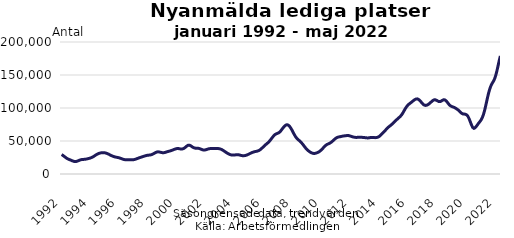
| Category | Series 0 |
|---|---|
| 1992.0 | 29480.354 |
| nan | 28295.696 |
| nan | 26913.85 |
| nan | 25477.81 |
| nan | 24127.512 |
| nan | 23002.58 |
| nan | 22155.383 |
| nan | 21457.833 |
| nan | 20717.486 |
| nan | 19914.451 |
| nan | 19238.304 |
| nan | 18853.792 |
| nan | 18929.346 |
| nan | 19447.209 |
| nan | 20222.154 |
| nan | 21019.832 |
| nan | 21638.498 |
| nan | 21956.335 |
| nan | 22084.468 |
| nan | 22247.052 |
| nan | 22501.828 |
| nan | 22845.831 |
| nan | 23261.049 |
| nan | 23738.07 |
| 1994.0 | 24324.906 |
| nan | 25049.806 |
| nan | 25955.045 |
| nan | 27078.029 |
| nan | 28325.565 |
| nan | 29517.866 |
| nan | 30500.082 |
| nan | 31227.831 |
| nan | 31748.909 |
| nan | 32146.252 |
| nan | 32323.003 |
| nan | 32297.941 |
| nan | 32066.145 |
| nan | 31577.25 |
| nan | 30898.522 |
| nan | 30048.377 |
| nan | 29077.009 |
| nan | 28162.808 |
| nan | 27332.881 |
| nan | 26566.956 |
| nan | 25974.012 |
| nan | 25562.385 |
| nan | 25202.474 |
| nan | 24849.817 |
| 1996.0 | 24346.643 |
| nan | 23717.093 |
| nan | 23034.567 |
| nan | 22358.507 |
| nan | 21859.059 |
| nan | 21586.713 |
| nan | 21478.229 |
| nan | 21481.852 |
| nan | 21473.305 |
| nan | 21402.079 |
| nan | 21410.324 |
| nan | 21507.307 |
| nan | 21765.412 |
| nan | 22273.67 |
| nan | 22897.424 |
| nan | 23569.016 |
| nan | 24261.453 |
| nan | 24890.283 |
| nan | 25489.139 |
| nan | 26075.808 |
| nan | 26682.501 |
| nan | 27301.593 |
| nan | 27867.632 |
| nan | 28278.9 |
| 1998.0 | 28529.016 |
| nan | 28691.848 |
| nan | 28995.719 |
| nan | 29600.406 |
| nan | 30466.934 |
| nan | 31497.214 |
| nan | 32534.847 |
| nan | 33305.431 |
| nan | 33600.298 |
| nan | 33386.99 |
| nan | 32949.643 |
| nan | 32488.886 |
| nan | 32233.319 |
| nan | 32344.363 |
| nan | 32741.234 |
| nan | 33350.71 |
| nan | 33962.663 |
| nan | 34467.893 |
| nan | 34975.758 |
| nan | 35556.485 |
| nan | 36214.074 |
| nan | 36973.075 |
| nan | 37687.105 |
| nan | 38257.472 |
| 2000.0 | 38621.123 |
| nan | 38519.491 |
| nan | 38136.336 |
| nan | 37831.522 |
| nan | 37861.54 |
| nan | 38429.195 |
| nan | 39489.467 |
| nan | 40949.947 |
| nan | 42498.245 |
| nan | 43571.771 |
| nan | 43670.076 |
| nan | 42891.24 |
| nan | 41610.902 |
| nan | 40374.347 |
| nan | 39568.488 |
| nan | 39136.694 |
| nan | 39027.603 |
| nan | 39024.347 |
| nan | 38744.869 |
| nan | 38119.748 |
| nan | 37323.39 |
| nan | 36628.944 |
| nan | 36283.726 |
| nan | 36458.739 |
| 2002.0 | 36928.067 |
| nan | 37543.713 |
| nan | 38133.537 |
| nan | 38446.343 |
| nan | 38515.878 |
| nan | 38457.017 |
| nan | 38451.435 |
| nan | 38534.178 |
| nan | 38599.809 |
| nan | 38610.029 |
| nan | 38509.351 |
| nan | 38221.437 |
| nan | 37670.383 |
| nan | 36865.356 |
| nan | 35762.005 |
| nan | 34529.413 |
| nan | 33298.501 |
| nan | 32075.164 |
| nan | 30962.868 |
| nan | 30014.234 |
| nan | 29272.074 |
| nan | 28784.995 |
| nan | 28610.435 |
| nan | 28658.771 |
| 2004.0 | 28922.799 |
| nan | 29227.993 |
| nan | 29297.582 |
| nan | 29063.631 |
| nan | 28579.689 |
| nan | 28063.258 |
| nan | 27756.917 |
| nan | 27684.535 |
| nan | 27892.932 |
| nan | 28340.013 |
| nan | 29012.874 |
| nan | 29861.867 |
| nan | 30811.299 |
| nan | 31697.77 |
| nan | 32497.066 |
| nan | 33202.457 |
| nan | 33759.356 |
| nan | 34151.548 |
| nan | 34515.383 |
| nan | 35093.456 |
| nan | 35968.484 |
| nan | 37215.039 |
| nan | 38804.357 |
| nan | 40536.474 |
| 2006.0 | 42350.863 |
| nan | 44040.005 |
| nan | 45536.135 |
| nan | 47052.791 |
| nan | 48835.916 |
| nan | 51000.066 |
| nan | 53336.821 |
| nan | 55724.12 |
| nan | 57957.101 |
| nan | 59700.113 |
| nan | 60791.567 |
| nan | 61558.089 |
| nan | 62327.402 |
| nan | 63604.924 |
| nan | 65741.371 |
| nan | 68200.789 |
| nan | 70508.816 |
| nan | 72610.398 |
| nan | 74103.618 |
| nan | 74633.496 |
| nan | 74024.754 |
| nan | 72435.592 |
| nan | 69956.03 |
| nan | 66842.579 |
| 2008.0 | 63350.345 |
| nan | 59885.51 |
| nan | 56752.009 |
| nan | 54262.522 |
| nan | 52463.682 |
| nan | 50866.682 |
| nan | 49188.829 |
| nan | 47333.874 |
| nan | 45143.009 |
| nan | 42770.418 |
| nan | 40370.834 |
| nan | 38144.65 |
| nan | 36245.547 |
| nan | 34733.197 |
| nan | 33442.234 |
| nan | 32380.163 |
| nan | 31593.033 |
| nan | 31162.399 |
| nan | 31221.376 |
| nan | 31651.984 |
| nan | 32279.103 |
| nan | 33078.472 |
| nan | 34253.649 |
| nan | 35754.387 |
| 2010.0 | 37512.801 |
| nan | 39475.582 |
| nan | 41444.908 |
| nan | 43228.085 |
| nan | 44566.54 |
| nan | 45468.278 |
| nan | 46288.53 |
| nan | 47311.137 |
| nan | 48641.561 |
| nan | 50212.369 |
| nan | 51875.335 |
| nan | 53483.76 |
| nan | 54868.373 |
| nan | 55720.688 |
| nan | 56143.981 |
| nan | 56484.73 |
| nan | 56887.142 |
| nan | 57339.843 |
| nan | 57651.989 |
| nan | 57856.896 |
| nan | 58096.745 |
| nan | 58294.753 |
| nan | 58222.027 |
| nan | 57842.103 |
| 2012.0 | 57200.912 |
| nan | 56518.422 |
| nan | 56038.931 |
| nan | 55669.988 |
| nan | 55446.893 |
| nan | 55468.873 |
| nan | 55597.562 |
| nan | 55715.461 |
| nan | 55727.63 |
| nan | 55595.648 |
| nan | 55372.822 |
| nan | 55222.022 |
| nan | 55031.043 |
| nan | 54780.395 |
| nan | 54657.535 |
| nan | 54810.726 |
| nan | 55169.771 |
| nan | 55398.982 |
| nan | 55411.003 |
| nan | 55229.956 |
| nan | 55075.5 |
| nan | 55160.151 |
| nan | 55582.026 |
| nan | 56354.403 |
| 2014.0 | 57612.593 |
| nan | 59414.921 |
| nan | 61306.931 |
| nan | 63118.95 |
| nan | 65032.692 |
| nan | 67068.427 |
| nan | 69019.473 |
| nan | 70808.136 |
| nan | 72347.992 |
| nan | 73743.213 |
| nan | 75345.034 |
| nan | 77020.735 |
| nan | 78749.626 |
| nan | 80578.334 |
| nan | 82364.477 |
| nan | 84068.635 |
| nan | 85648.289 |
| nan | 87315.363 |
| nan | 89496.47 |
| nan | 92229.577 |
| nan | 95452.14 |
| nan | 98701.919 |
| nan | 101517.469 |
| nan | 103796.737 |
| 2016.0 | 105635.899 |
| nan | 107060.966 |
| nan | 108431.79 |
| nan | 109942.619 |
| nan | 111420.925 |
| nan | 112739.81 |
| nan | 113639.362 |
| nan | 113856.593 |
| nan | 113113.037 |
| nan | 111577.685 |
| nan | 109599.712 |
| nan | 107351.864 |
| nan | 105492.872 |
| nan | 104328.91 |
| nan | 103921.758 |
| nan | 104281.058 |
| nan | 105210.649 |
| nan | 106626.464 |
| nan | 108188.211 |
| nan | 109847.723 |
| nan | 111367.286 |
| nan | 112357.683 |
| nan | 112341.941 |
| nan | 111666.507 |
| 2018.0 | 110630.821 |
| nan | 109697.385 |
| nan | 109720.801 |
| nan | 110560.446 |
| nan | 111724.984 |
| nan | 112520.743 |
| nan | 112211.256 |
| nan | 110790.925 |
| nan | 108588.61 |
| nan | 106211.964 |
| nan | 104138.639 |
| nan | 102833.736 |
| nan | 101968.606 |
| nan | 101368.543 |
| nan | 100610.476 |
| nan | 99467.215 |
| nan | 98298.572 |
| nan | 96934.791 |
| nan | 95271.131 |
| nan | 93395.765 |
| nan | 91830.142 |
| nan | 91033.401 |
| nan | 90822.122 |
| nan | 90544.503 |
| 2020.0 | 89642.557 |
| nan | 87549.052 |
| nan | 83912.233 |
| nan | 79225.788 |
| nan | 74388.354 |
| nan | 70622.257 |
| nan | 69166.533 |
| nan | 70012.257 |
| nan | 72112.595 |
| nan | 74594.551 |
| nan | 77168.125 |
| nan | 79423.794 |
| nan | 81891.321 |
| nan | 85497.034 |
| nan | 90430.051 |
| nan | 97006.406 |
| nan | 104848.499 |
| nan | 113117.021 |
| nan | 121116.331 |
| nan | 127787.074 |
| nan | 132939.342 |
| nan | 136830.087 |
| nan | 139802.314 |
| nan | 143361.09 |
| 2022.0 | 148510.969 |
| nan | 155306.254 |
| nan | 163383.84 |
| nan | 171672.535 |
| nan | 178820.09 |